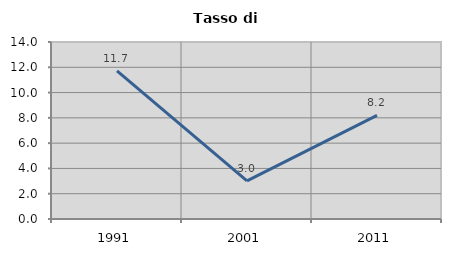
| Category | Tasso di disoccupazione   |
|---|---|
| 1991.0 | 11.717 |
| 2001.0 | 3.011 |
| 2011.0 | 8.198 |